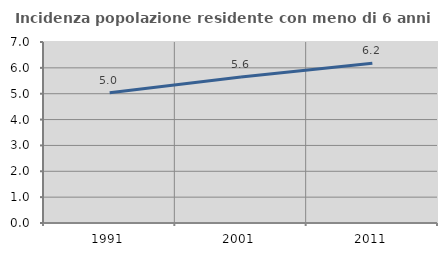
| Category | Incidenza popolazione residente con meno di 6 anni |
|---|---|
| 1991.0 | 5.039 |
| 2001.0 | 5.649 |
| 2011.0 | 6.182 |